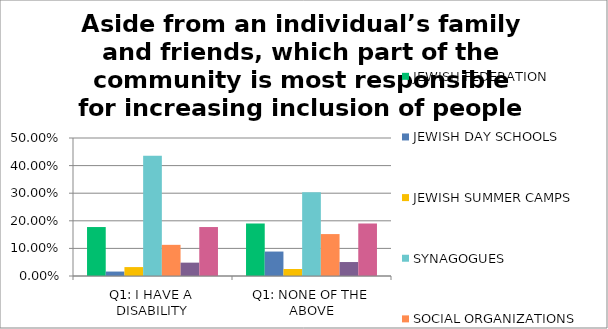
| Category | JEWISH FEDERATION | JEWISH DAY SCHOOLS | JEWISH SUMMER CAMPS | SYNAGOGUES | SOCIAL ORGANIZATIONS | NON-INSTITUTIONAL, NON-MEMBERSHIP JEWISH GROUPS(I.E. POP-UP SHABBAT, CHAVURAHS) | Other (please specify) |
|---|---|---|---|---|---|---|---|
| Q1: I HAVE A DISABILITY | 0.177 | 0.016 | 0.032 | 0.436 | 0.113 | 0.048 | 0.177 |
| Q1: NONE OF THE ABOVE | 0.19 | 0.089 | 0.025 | 0.304 | 0.152 | 0.051 | 0.19 |